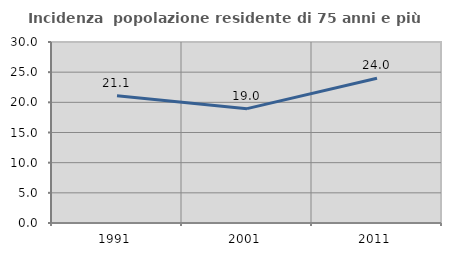
| Category | Incidenza  popolazione residente di 75 anni e più |
|---|---|
| 1991.0 | 21.08 |
| 2001.0 | 18.951 |
| 2011.0 | 23.997 |